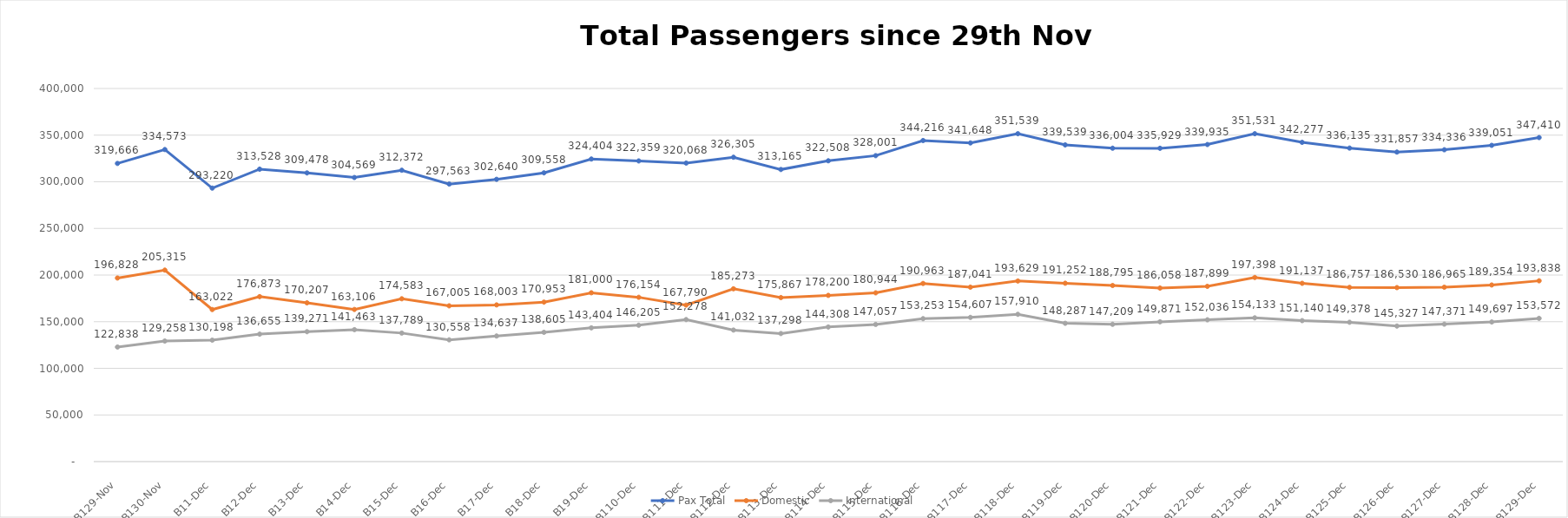
| Category | Pax Total |  Domestic  |  International  |
|---|---|---|---|
| 2022-11-29 | 319666 | 196828 | 122838 |
| 2022-11-30 | 334573 | 205315 | 129258 |
| 2022-12-01 | 293220 | 163022 | 130198 |
| 2022-12-02 | 313528 | 176873 | 136655 |
| 2022-12-03 | 309478 | 170207 | 139271 |
| 2022-12-04 | 304569 | 163106 | 141463 |
| 2022-12-05 | 312372 | 174583 | 137789 |
| 2022-12-06 | 297563 | 167005 | 130558 |
| 2022-12-07 | 302640 | 168003 | 134637 |
| 2022-12-08 | 309558 | 170953 | 138605 |
| 2022-12-09 | 324404 | 181000 | 143404 |
| 2022-12-10 | 322359 | 176154 | 146205 |
| 2022-12-11 | 320068 | 167790 | 152278 |
| 2022-12-12 | 326305 | 185273 | 141032 |
| 2022-12-13 | 313165 | 175867 | 137298 |
| 2022-12-14 | 322508 | 178200 | 144308 |
| 2022-12-15 | 328001 | 180944 | 147057 |
| 2022-12-16 | 344216 | 190963 | 153253 |
| 2022-12-17 | 341648 | 187041 | 154607 |
| 2022-12-18 | 351539 | 193629 | 157910 |
| 2022-12-19 | 339539 | 191252 | 148287 |
| 2022-12-20 | 336004 | 188795 | 147209 |
| 2022-12-21 | 335929 | 186058 | 149871 |
| 2022-12-22 | 339935 | 187899 | 152036 |
| 2022-12-23 | 351531 | 197398 | 154133 |
| 2022-12-24 | 342277 | 191137 | 151140 |
| 2022-12-25 | 336135 | 186757 | 149378 |
| 2022-12-26 | 331857 | 186530 | 145327 |
| 2022-12-27 | 334336 | 186965 | 147371 |
| 2022-12-28 | 339051 | 189354 | 149697 |
| 2022-12-29 | 347410 | 193838 | 153572 |